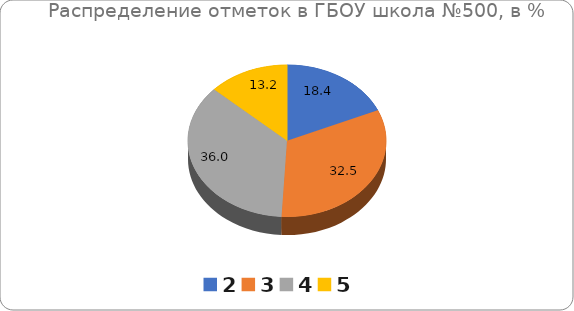
| Category | ГБОУ СОШ №500 |
|---|---|
| 2.0 | 18.42 |
| 3.0 | 32.46 |
| 4.0 | 35.96 |
| 5.0 | 13.16 |